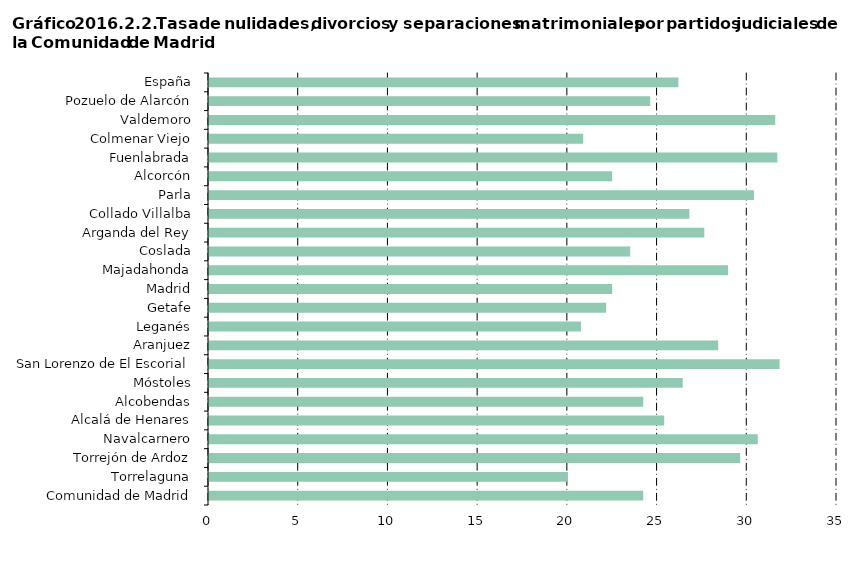
| Category | Series 0 |
|---|---|
| Comunidad de Madrid | 24.201 |
|     Torrelaguna | 20.004 |
|     Torrejón de Ardoz | 29.603 |
|     Navalcarnero | 30.586 |
|     Alcalá de Henares | 25.369 |
|     Alcobendas | 24.201 |
|     Móstoles | 26.403 |
|     San Lorenzo de El Escorial | 31.801 |
|     Aranjuez | 28.377 |
|     Leganés | 20.729 |
|     Getafe | 22.133 |
|     Madrid | 22.47 |
|     Majadahonda | 28.93 |
|     Coslada | 23.474 |
|     Arganda del Rey | 27.605 |
|     Collado Villalba | 26.77 |
|     Parla | 30.37 |
|     Alcorcón | 22.467 |
|     Fuenlabrada | 31.675 |
|     Colmenar Viejo | 20.855 |
|     Valdemoro | 31.559 |
|     Pozuelo de Alarcón | 24.591 |
| España | 26.159 |